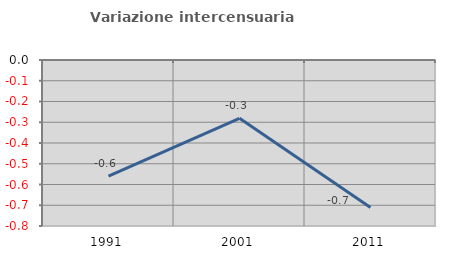
| Category | Variazione intercensuaria annua |
|---|---|
| 1991.0 | -0.559 |
| 2001.0 | -0.281 |
| 2011.0 | -0.711 |